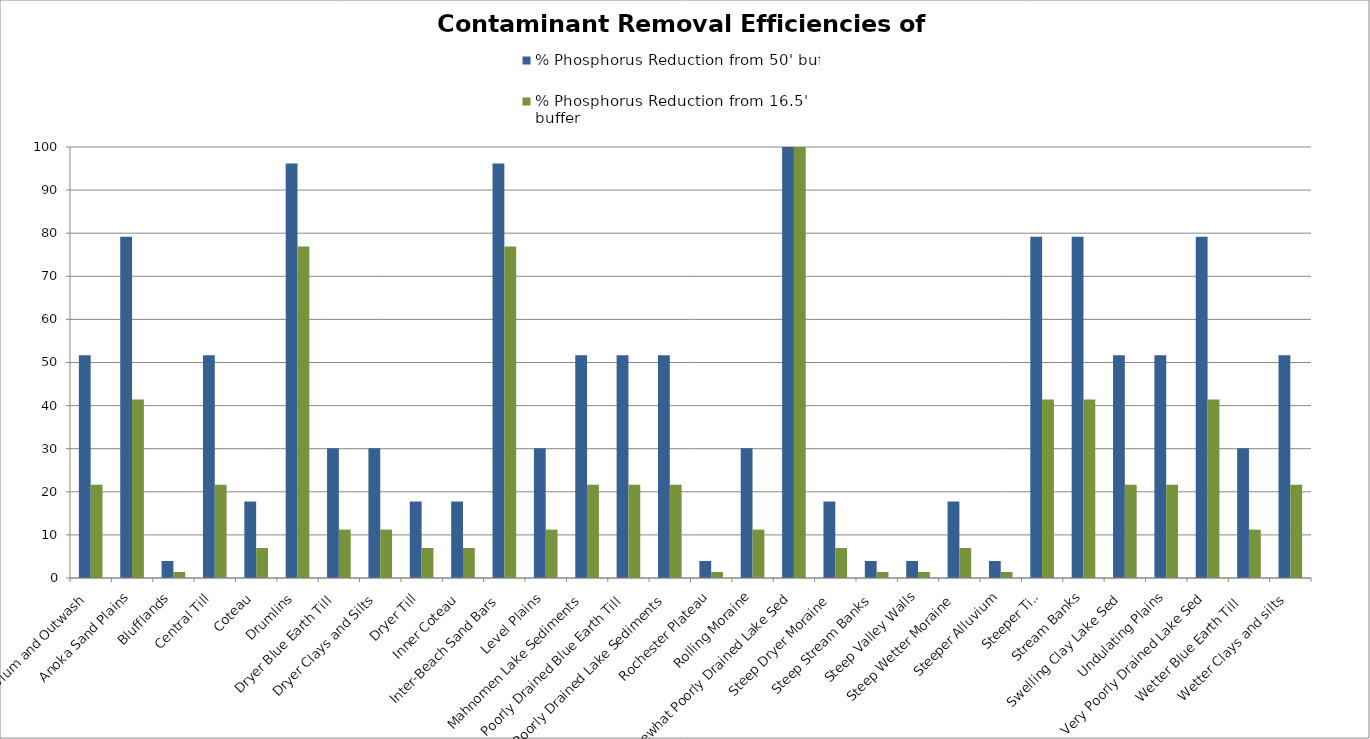
| Category | % Phosphorus Reduction from 50' buffer | % Phosphorus Reduction from 16.5' buffer |
|---|---|---|
| Alluvium and Outwash | 51.679 | 21.65 |
| Anoka Sand Plains | 79.198 | 41.44 |
| Blufflands | 3.947 | 1.386 |
| Central Till | 51.679 | 21.65 |
| Coteau | 17.747 | 6.967 |
| Drumlins | 96.185 | 76.942 |
| Dryer Blue Earth Till | 30.101 | 11.227 |
| Dryer Clays and Silts | 30.101 | 11.227 |
| Dryer Till | 17.747 | 6.967 |
| Inner Coteau | 17.747 | 6.967 |
| Inter-Beach Sand Bars | 96.185 | 76.942 |
| Level Plains | 30.101 | 11.227 |
| Mahnomen Lake Sediments | 51.679 | 21.65 |
| Poorly Drained Blue Earth Till | 51.679 | 21.65 |
| Poorly Drained Lake Sediments | 51.679 | 21.65 |
| Rochester Plateau | 3.947 | 1.386 |
| Rolling Moraine | 30.101 | 11.227 |
| Somewhat Poorly Drained Lake Sed | 100 | 100 |
| Steep Dryer Moraine | 17.747 | 6.967 |
| Steep Stream Banks | 3.947 | 1.386 |
| Steep Valley Walls | 3.947 | 1.386 |
| Steep Wetter Moraine | 17.747 | 6.967 |
| Steeper Alluvium | 3.947 | 1.386 |
| Steeper Till | 79.198 | 41.44 |
| Stream Banks | 79.198 | 41.44 |
| Swelling Clay Lake Sed | 51.679 | 21.65 |
| Undulating Plains | 51.679 | 21.65 |
| Very Poorly Drained Lake Sed | 79.198 | 41.44 |
| Wetter Blue Earth Till  | 30.101 | 11.227 |
| Wetter Clays and silts | 51.679 | 21.65 |